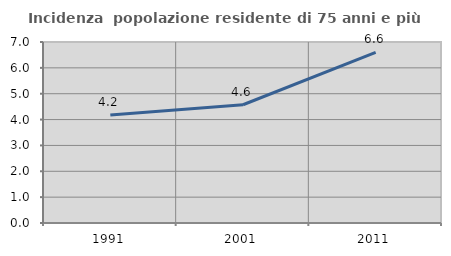
| Category | Incidenza  popolazione residente di 75 anni e più |
|---|---|
| 1991.0 | 4.175 |
| 2001.0 | 4.573 |
| 2011.0 | 6.595 |